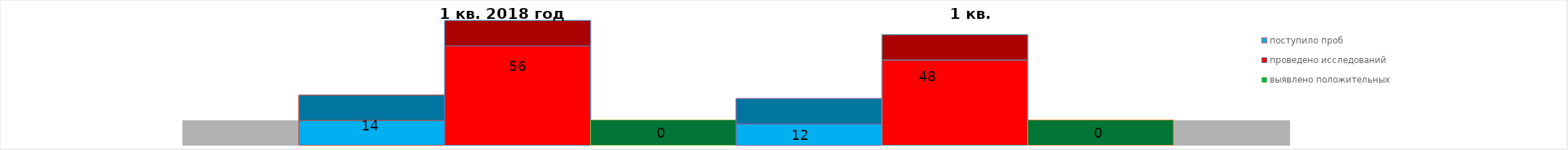
| Category | поступило проб | проведено исследований | выявлено положительных | 1 квартал 2019 год | 2016 год |
|---|---|---|---|---|---|
| 0 | 14 | 56 | 0 | 0 | 48 |